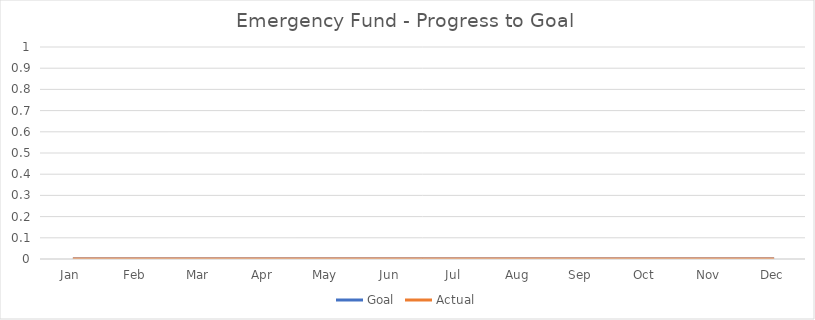
| Category | Goal | Actual |
|---|---|---|
| Jan | 0 | 0 |
| Feb | 0 | 0 |
| Mar | 0 | 0 |
| Apr | 0 | 0 |
| May | 0 | 0 |
| Jun | 0 | 0 |
| Jul | 0 | 0 |
| Aug | 0 | 0 |
| Sep | 0 | 0 |
| Oct | 0 | 0 |
| Nov | 0 | 0 |
| Dec | 0 | 0 |